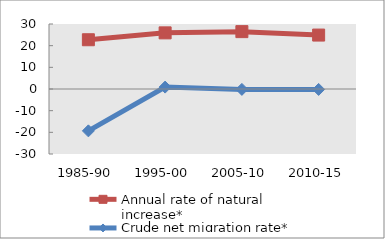
| Category | Annual rate of natural increase* | Crude net migration rate* |
|---|---|---|
| 1985-90 | 22.732 | -19.326 |
| 1995-00 | 25.91 | 0.876 |
| 2005-10 | 26.474 | -0.178 |
| 2010-15 | 24.894 | -0.196 |